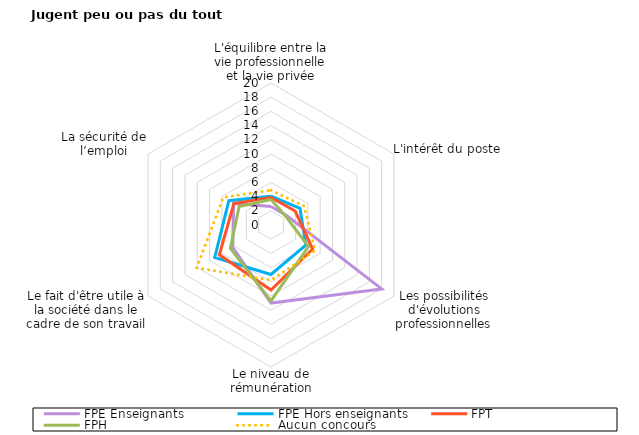
| Category | FPE Enseignants | FPE Hors enseignants | FPT  | FPH | Aucun concours |
|---|---|---|---|---|---|
| L'équilibre entre la vie professionnelle et la vie privée | 2.61 | 4.062 | 3.88 | 3.58 | 4.9 |
| L'intérêt du poste | 2.586 | 4.721 | 3.93 | 2.41 | 5.36 |
| Les possibilités d'évolutions professionnelles | 17.995 | 5.649 | 6.77 | 6.09 | 7.18 |
| Le niveau de rémunération | 10.992 | 6.968 | 9.15 | 10.69 | 7.79 |
| Le fait d'être utile à la société dans le cadre de son travail | 6.251 | 9.149 | 8.4 | 6.61 | 12.08 |
| La sécurité de l’emploi | 6.073 | 6.855 | 6.04 | 5.19 | 7.77 |